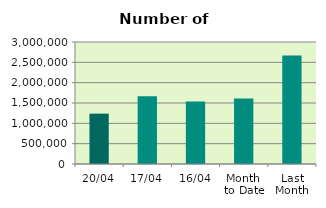
| Category | Series 0 |
|---|---|
| 20/04 | 1238748 |
| 17/04 | 1664020 |
| 16/04 | 1537644 |
| Month 
to Date | 1612893.167 |
| Last
Month | 2666736.455 |